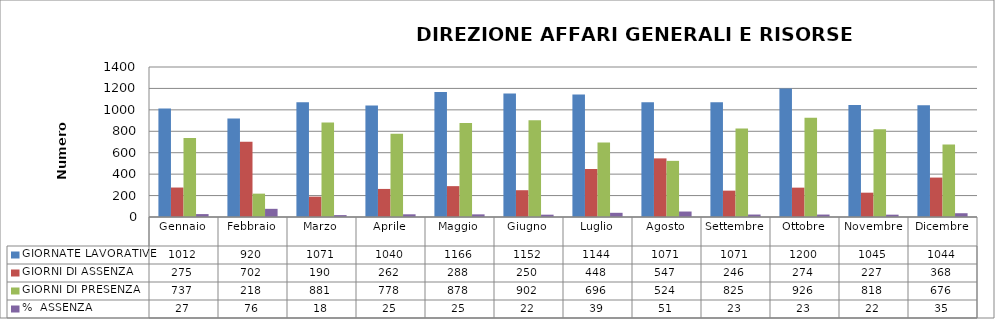
| Category | GIORNATE LAVORATIVE | GIORNI DI ASSENZA | GIORNI DI PRESENZA | %  ASSENZA |
|---|---|---|---|---|
| Gennaio | 1012 | 275 | 737 | 27.174 |
| Febbraio | 920 | 702 | 218 | 76.304 |
| Marzo | 1071 | 190 | 881 | 17.74 |
| Aprile | 1040 | 262 | 778 | 25.192 |
| Maggio | 1166 | 288 | 878 | 24.7 |
| Giugno | 1152 | 250 | 902 | 21.701 |
| Luglio | 1144 | 448 | 696 | 39.161 |
| Agosto | 1071 | 547 | 524 | 51.074 |
| Settembre | 1071 | 246 | 825 | 22.969 |
| Ottobre | 1200 | 274 | 926 | 22.833 |
| Novembre | 1045 | 227 | 818 | 21.722 |
| Dicembre | 1044 | 368 | 676 | 35.249 |